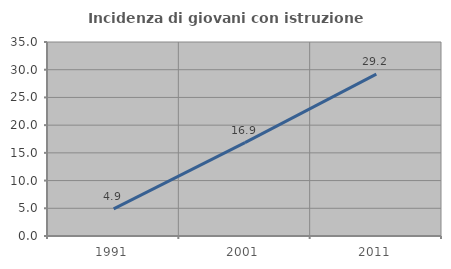
| Category | Incidenza di giovani con istruzione universitaria |
|---|---|
| 1991.0 | 4.878 |
| 2001.0 | 16.854 |
| 2011.0 | 29.213 |